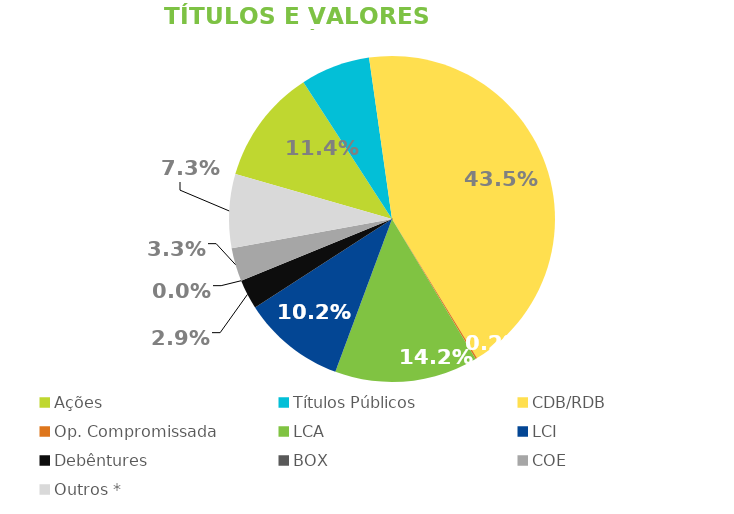
| Category | TVM |
|---|---|
| Ações | 0.114 |
| Títulos Públicos | 0.069 |
| CDB/RDB | 0.435 |
| Op. Compromissada | 0.002 |
| LCA | 0.142 |
| LCI | 0.102 |
| Debêntures | 0.029 |
| BOX | 0 |
| COE | 0.033 |
| Outros * | 0.073 |